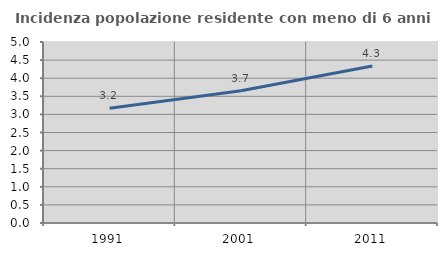
| Category | Incidenza popolazione residente con meno di 6 anni |
|---|---|
| 1991.0 | 3.173 |
| 2001.0 | 3.656 |
| 2011.0 | 4.334 |